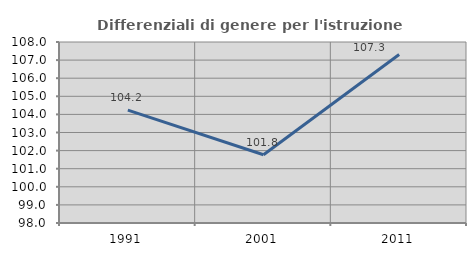
| Category | Differenziali di genere per l'istruzione superiore |
|---|---|
| 1991.0 | 104.233 |
| 2001.0 | 101.769 |
| 2011.0 | 107.311 |